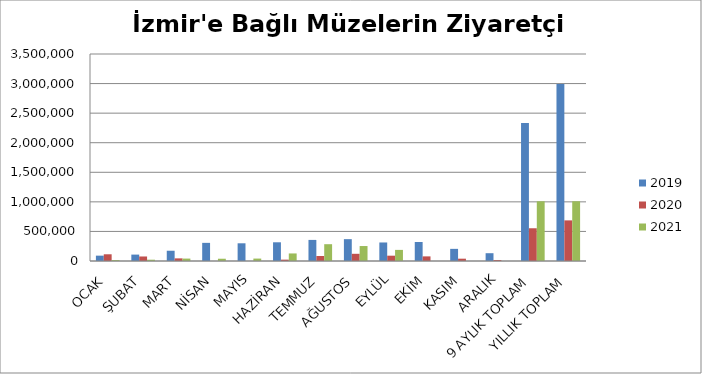
| Category | 2019 | 2020 | 2021 |
|---|---|---|---|
| OCAK | 90406 | 113675 | 14992 |
| ŞUBAT | 108321 | 76403 | 21877 |
| MART | 173542 | 44613 | 40903 |
| NİSAN | 306745 | 0 | 38306 |
| MAYIS | 299441 | 0 | 40946 |
| HAZİRAN | 316361 | 22885 | 127729 |
| TEMMUZ | 356504 | 84548 | 284174 |
| AĞUSTOS | 369370 | 121753 | 253129 |
| EYLÜL | 313284 | 89757 | 187775 |
| EKİM | 321498 | 78061 | 0 |
| KASIM | 205258 | 39134 | 0 |
| ARALIK | 131881 | 16010 | 0 |
| 9 AYLIK TOPLAM | 2333974 | 553634 | 1009831 |
| YILLIK TOPLAM | 2992611 | 686839 | 1009831 |